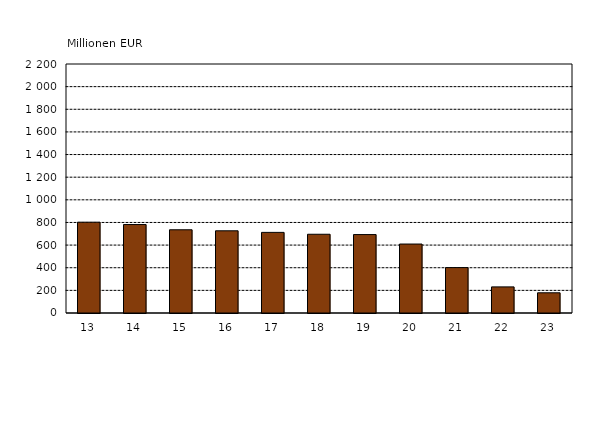
| Category | Series 0 |
|---|---|
| 13 | 802.234 |
| 14 | 781.588 |
| 15 | 735.286 |
| 16 | 726.273 |
| 17 | 712.338 |
| 18 | 695.747 |
| 19 | 692.951 |
| 20 | 609.306 |
| 21 | 401.095 |
| 22 | 230.611 |
| 23 | 178.609 |